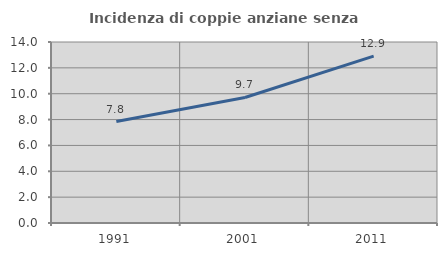
| Category | Incidenza di coppie anziane senza figli  |
|---|---|
| 1991.0 | 7.846 |
| 2001.0 | 9.71 |
| 2011.0 | 12.911 |